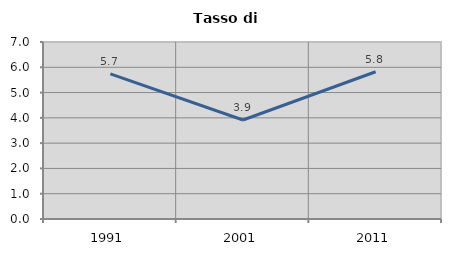
| Category | Tasso di disoccupazione   |
|---|---|
| 1991.0 | 5.737 |
| 2001.0 | 3.916 |
| 2011.0 | 5.823 |